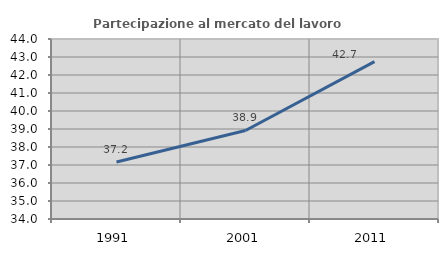
| Category | Partecipazione al mercato del lavoro  femminile |
|---|---|
| 1991.0 | 37.166 |
| 2001.0 | 38.919 |
| 2011.0 | 42.747 |